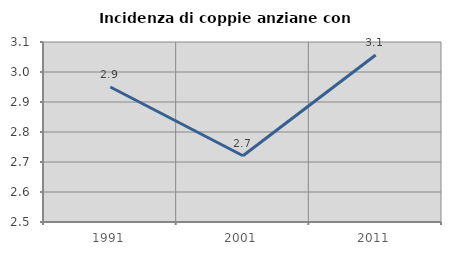
| Category | Incidenza di coppie anziane con figli |
|---|---|
| 1991.0 | 2.95 |
| 2001.0 | 2.721 |
| 2011.0 | 3.057 |